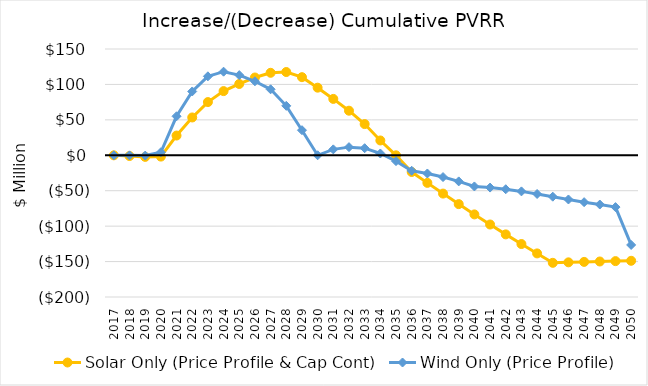
| Category | Solar Only (Price Profile & Cap Cont) | Wind Only (Price Profile) |
|---|---|---|
| 2017.0 | -0.07 | -0.07 |
| 2018.0 | -1.033 | -0.082 |
| 2019.0 | -2.269 | -0.43 |
| 2020.0 | -1.841 | 4.265 |
| 2021.0 | 27.854 | 55.054 |
| 2022.0 | 53.385 | 90.059 |
| 2023.0 | 75.103 | 111.416 |
| 2024.0 | 90.572 | 117.992 |
| 2025.0 | 100.661 | 113.15 |
| 2026.0 | 109.766 | 104.441 |
| 2027.0 | 116.425 | 93.112 |
| 2028.0 | 117.504 | 69.781 |
| 2029.0 | 110.256 | 35.402 |
| 2030.0 | 95.422 | 0.008 |
| 2031.0 | 79.561 | 8.347 |
| 2032.0 | 62.922 | 11.503 |
| 2033.0 | 44.055 | 9.998 |
| 2034.0 | 20.908 | 2.534 |
| 2035.0 | -0.06 | -8.252 |
| 2036.0 | -23.575 | -21.854 |
| 2037.0 | -38.938 | -25.685 |
| 2038.0 | -54.057 | -30.741 |
| 2039.0 | -68.908 | -36.846 |
| 2040.0 | -83.436 | -43.978 |
| 2041.0 | -97.694 | -45.556 |
| 2042.0 | -111.634 | -47.929 |
| 2043.0 | -125.244 | -50.952 |
| 2044.0 | -138.49 | -54.604 |
| 2045.0 | -151.754 | -58.432 |
| 2046.0 | -151.073 | -62.365 |
| 2047.0 | -150.451 | -66.164 |
| 2048.0 | -149.884 | -69.486 |
| 2049.0 | -149.368 | -73.132 |
| 2050.0 | -148.897 | -126.54 |